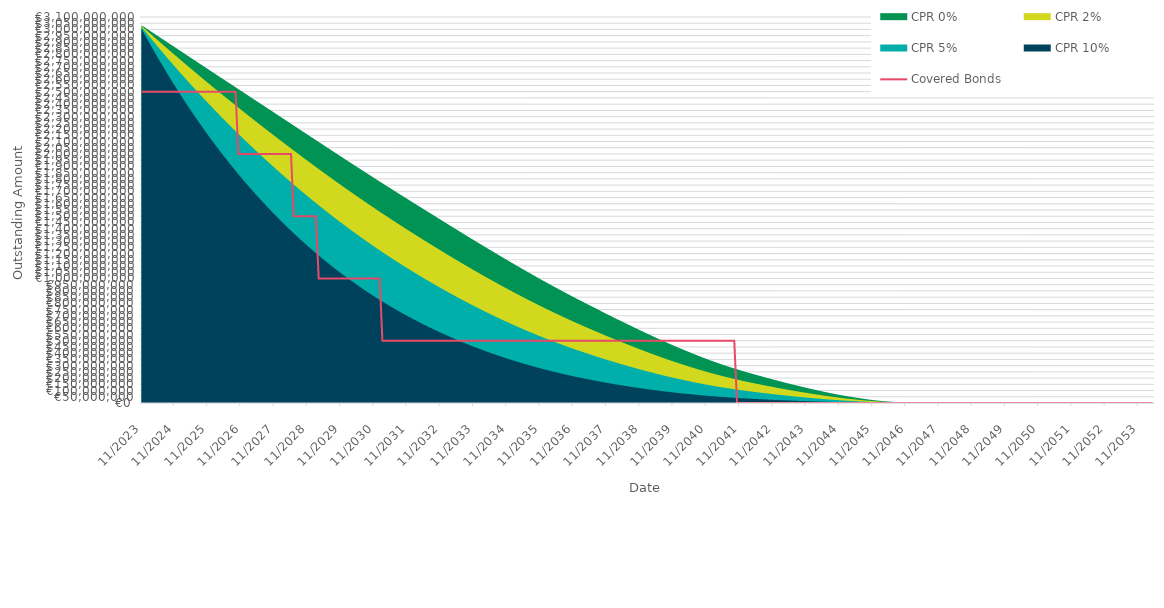
| Category | Covered Bonds |
|---|---|
| 2023-11-30 | 2500000000 |
| 2023-12-31 | 2500000000 |
| 2024-01-31 | 2500000000 |
| 2024-02-29 | 2500000000 |
| 2024-03-31 | 2500000000 |
| 2024-04-30 | 2500000000 |
| 2024-05-31 | 2500000000 |
| 2024-06-30 | 2500000000 |
| 2024-07-31 | 2500000000 |
| 2024-08-31 | 2500000000 |
| 2024-09-30 | 2500000000 |
| 2024-10-31 | 2500000000 |
| 2024-11-30 | 2500000000 |
| 2024-12-31 | 2500000000 |
| 2025-01-31 | 2500000000 |
| 2025-02-28 | 2500000000 |
| 2025-03-31 | 2500000000 |
| 2025-04-30 | 2500000000 |
| 2025-05-31 | 2500000000 |
| 2025-06-30 | 2500000000 |
| 2025-07-31 | 2500000000 |
| 2025-08-31 | 2500000000 |
| 2025-09-30 | 2500000000 |
| 2025-10-31 | 2500000000 |
| 2025-11-30 | 2500000000 |
| 2025-12-31 | 2500000000 |
| 2026-01-31 | 2500000000 |
| 2026-02-28 | 2500000000 |
| 2026-03-31 | 2500000000 |
| 2026-04-30 | 2500000000 |
| 2026-05-31 | 2500000000 |
| 2026-06-30 | 2500000000 |
| 2026-07-31 | 2500000000 |
| 2026-08-31 | 2500000000 |
| 2026-09-30 | 2500000000 |
| 2026-10-31 | 2000000000 |
| 2026-11-30 | 2000000000 |
| 2026-12-31 | 2000000000 |
| 2027-01-31 | 2000000000 |
| 2027-02-28 | 2000000000 |
| 2027-03-31 | 2000000000 |
| 2027-04-30 | 2000000000 |
| 2027-05-31 | 2000000000 |
| 2027-06-30 | 2000000000 |
| 2027-07-31 | 2000000000 |
| 2027-08-31 | 2000000000 |
| 2027-09-30 | 2000000000 |
| 2027-10-31 | 2000000000 |
| 2027-11-30 | 2000000000 |
| 2027-12-31 | 2000000000 |
| 2028-01-31 | 2000000000 |
| 2028-02-29 | 2000000000 |
| 2028-03-31 | 2000000000 |
| 2028-04-30 | 2000000000 |
| 2028-05-31 | 2000000000 |
| 2028-06-30 | 1500000000 |
| 2028-07-31 | 1500000000 |
| 2028-08-31 | 1500000000 |
| 2028-09-30 | 1500000000 |
| 2028-10-31 | 1500000000 |
| 2028-11-30 | 1500000000 |
| 2028-12-31 | 1500000000 |
| 2029-01-31 | 1500000000 |
| 2029-02-28 | 1500000000 |
| 2029-03-31 | 1000000000 |
| 2029-04-30 | 1000000000 |
| 2029-05-31 | 1000000000 |
| 2029-06-30 | 1000000000 |
| 2029-07-31 | 1000000000 |
| 2029-08-31 | 1000000000 |
| 2029-09-30 | 1000000000 |
| 2029-10-31 | 1000000000 |
| 2029-11-30 | 1000000000 |
| 2029-12-31 | 1000000000 |
| 2030-01-31 | 1000000000 |
| 2030-02-28 | 1000000000 |
| 2030-03-31 | 1000000000 |
| 2030-04-30 | 1000000000 |
| 2030-05-31 | 1000000000 |
| 2030-06-30 | 1000000000 |
| 2030-07-31 | 1000000000 |
| 2030-08-31 | 1000000000 |
| 2030-09-30 | 1000000000 |
| 2030-10-31 | 1000000000 |
| 2030-11-30 | 1000000000 |
| 2030-12-31 | 1000000000 |
| 2031-01-31 | 1000000000 |
| 2031-02-28 | 500000000 |
| 2031-03-31 | 500000000 |
| 2031-04-30 | 500000000 |
| 2031-05-31 | 500000000 |
| 2031-06-30 | 500000000 |
| 2031-07-31 | 500000000 |
| 2031-08-31 | 500000000 |
| 2031-09-30 | 500000000 |
| 2031-10-31 | 500000000 |
| 2031-11-30 | 500000000 |
| 2031-12-31 | 500000000 |
| 2032-01-31 | 500000000 |
| 2032-02-29 | 500000000 |
| 2032-03-31 | 500000000 |
| 2032-04-30 | 500000000 |
| 2032-05-31 | 500000000 |
| 2032-06-30 | 500000000 |
| 2032-07-31 | 500000000 |
| 2032-08-31 | 500000000 |
| 2032-09-30 | 500000000 |
| 2032-10-31 | 500000000 |
| 2032-11-30 | 500000000 |
| 2032-12-31 | 500000000 |
| 2033-01-31 | 500000000 |
| 2033-02-28 | 500000000 |
| 2033-03-31 | 500000000 |
| 2033-04-30 | 500000000 |
| 2033-05-31 | 500000000 |
| 2033-06-30 | 500000000 |
| 2033-07-31 | 500000000 |
| 2033-08-31 | 500000000 |
| 2033-09-30 | 500000000 |
| 2033-10-31 | 500000000 |
| 2033-11-30 | 500000000 |
| 2033-12-31 | 500000000 |
| 2034-01-31 | 500000000 |
| 2034-02-28 | 500000000 |
| 2034-03-31 | 500000000 |
| 2034-04-30 | 500000000 |
| 2034-05-31 | 500000000 |
| 2034-06-30 | 500000000 |
| 2034-07-31 | 500000000 |
| 2034-08-31 | 500000000 |
| 2034-09-30 | 500000000 |
| 2034-10-31 | 500000000 |
| 2034-11-30 | 500000000 |
| 2034-12-31 | 500000000 |
| 2035-01-31 | 500000000 |
| 2035-02-28 | 500000000 |
| 2035-03-31 | 500000000 |
| 2035-04-30 | 500000000 |
| 2035-05-31 | 500000000 |
| 2035-06-30 | 500000000 |
| 2035-07-31 | 500000000 |
| 2035-08-31 | 500000000 |
| 2035-09-30 | 500000000 |
| 2035-10-31 | 500000000 |
| 2035-11-30 | 500000000 |
| 2035-12-31 | 500000000 |
| 2036-01-31 | 500000000 |
| 2036-02-29 | 500000000 |
| 2036-03-31 | 500000000 |
| 2036-04-30 | 500000000 |
| 2036-05-31 | 500000000 |
| 2036-06-30 | 500000000 |
| 2036-07-31 | 500000000 |
| 2036-08-31 | 500000000 |
| 2036-09-30 | 500000000 |
| 2036-10-31 | 500000000 |
| 2036-11-30 | 500000000 |
| 2036-12-31 | 500000000 |
| 2037-01-31 | 500000000 |
| 2037-02-28 | 500000000 |
| 2037-03-31 | 500000000 |
| 2037-04-30 | 500000000 |
| 2037-05-31 | 500000000 |
| 2037-06-30 | 500000000 |
| 2037-07-31 | 500000000 |
| 2037-08-31 | 500000000 |
| 2037-09-30 | 500000000 |
| 2037-10-31 | 500000000 |
| 2037-11-30 | 500000000 |
| 2037-12-31 | 500000000 |
| 2038-01-31 | 500000000 |
| 2038-02-28 | 500000000 |
| 2038-03-31 | 500000000 |
| 2038-04-30 | 500000000 |
| 2038-05-31 | 500000000 |
| 2038-06-30 | 500000000 |
| 2038-07-31 | 500000000 |
| 2038-08-31 | 500000000 |
| 2038-09-30 | 500000000 |
| 2038-10-31 | 500000000 |
| 2038-11-30 | 500000000 |
| 2038-12-31 | 500000000 |
| 2039-01-31 | 500000000 |
| 2039-02-28 | 500000000 |
| 2039-03-31 | 500000000 |
| 2039-04-30 | 500000000 |
| 2039-05-31 | 500000000 |
| 2039-06-30 | 500000000 |
| 2039-07-31 | 500000000 |
| 2039-08-31 | 500000000 |
| 2039-09-30 | 500000000 |
| 2039-10-31 | 500000000 |
| 2039-11-30 | 500000000 |
| 2039-12-31 | 500000000 |
| 2040-01-31 | 500000000 |
| 2040-02-29 | 500000000 |
| 2040-03-31 | 500000000 |
| 2040-04-30 | 500000000 |
| 2040-05-31 | 500000000 |
| 2040-06-30 | 500000000 |
| 2040-07-31 | 500000000 |
| 2040-08-31 | 500000000 |
| 2040-09-30 | 500000000 |
| 2040-10-31 | 500000000 |
| 2040-11-30 | 500000000 |
| 2040-12-31 | 500000000 |
| 2041-01-31 | 500000000 |
| 2041-02-28 | 500000000 |
| 2041-03-31 | 500000000 |
| 2041-04-30 | 500000000 |
| 2041-05-31 | 500000000 |
| 2041-06-30 | 500000000 |
| 2041-07-31 | 500000000 |
| 2041-08-31 | 500000000 |
| 2041-09-30 | 500000000 |
| 2041-10-31 | 0 |
| 2041-11-30 | 0 |
| 2041-12-31 | 0 |
| 2042-01-31 | 0 |
| 2042-02-28 | 0 |
| 2042-03-31 | 0 |
| 2042-04-30 | 0 |
| 2042-05-31 | 0 |
| 2042-06-30 | 0 |
| 2042-07-31 | 0 |
| 2042-08-31 | 0 |
| 2042-09-30 | 0 |
| 2042-10-31 | 0 |
| 2042-11-30 | 0 |
| 2042-12-31 | 0 |
| 2043-01-31 | 0 |
| 2043-02-28 | 0 |
| 2043-03-31 | 0 |
| 2043-04-30 | 0 |
| 2043-05-31 | 0 |
| 2043-06-30 | 0 |
| 2043-07-31 | 0 |
| 2043-08-31 | 0 |
| 2043-09-30 | 0 |
| 2043-10-31 | 0 |
| 2043-11-30 | 0 |
| 2043-12-31 | 0 |
| 2044-01-31 | 0 |
| 2044-02-29 | 0 |
| 2044-03-31 | 0 |
| 2044-04-30 | 0 |
| 2044-05-31 | 0 |
| 2044-06-30 | 0 |
| 2044-07-31 | 0 |
| 2044-08-31 | 0 |
| 2044-09-30 | 0 |
| 2044-10-31 | 0 |
| 2044-11-30 | 0 |
| 2044-12-31 | 0 |
| 2045-01-31 | 0 |
| 2045-02-28 | 0 |
| 2045-03-31 | 0 |
| 2045-04-30 | 0 |
| 2045-05-31 | 0 |
| 2045-06-30 | 0 |
| 2045-07-31 | 0 |
| 2045-08-31 | 0 |
| 2045-09-30 | 0 |
| 2045-10-31 | 0 |
| 2045-11-30 | 0 |
| 2045-12-31 | 0 |
| 2046-01-31 | 0 |
| 2046-02-28 | 0 |
| 2046-03-31 | 0 |
| 2046-04-30 | 0 |
| 2046-05-31 | 0 |
| 2046-06-30 | 0 |
| 2046-07-31 | 0 |
| 2046-08-31 | 0 |
| 2046-09-30 | 0 |
| 2046-10-31 | 0 |
| 2046-11-30 | 0 |
| 2046-12-31 | 0 |
| 2047-01-31 | 0 |
| 2047-02-28 | 0 |
| 2047-03-31 | 0 |
| 2047-04-30 | 0 |
| 2047-05-31 | 0 |
| 2047-06-30 | 0 |
| 2047-07-31 | 0 |
| 2047-08-31 | 0 |
| 2047-09-30 | 0 |
| 2047-10-31 | 0 |
| 2047-11-30 | 0 |
| 2047-12-31 | 0 |
| 2048-01-31 | 0 |
| 2048-02-29 | 0 |
| 2048-03-31 | 0 |
| 2048-04-30 | 0 |
| 2048-05-31 | 0 |
| 2048-06-30 | 0 |
| 2048-07-31 | 0 |
| 2048-08-31 | 0 |
| 2048-09-30 | 0 |
| 2048-10-31 | 0 |
| 2048-11-30 | 0 |
| 2048-12-31 | 0 |
| 2049-01-31 | 0 |
| 2049-02-28 | 0 |
| 2049-03-31 | 0 |
| 2049-04-30 | 0 |
| 2049-05-31 | 0 |
| 2049-06-30 | 0 |
| 2049-07-31 | 0 |
| 2049-08-31 | 0 |
| 2049-09-30 | 0 |
| 2049-10-31 | 0 |
| 2049-11-30 | 0 |
| 2049-12-31 | 0 |
| 2050-01-31 | 0 |
| 2050-02-28 | 0 |
| 2050-03-31 | 0 |
| 2050-04-30 | 0 |
| 2050-05-31 | 0 |
| 2050-06-30 | 0 |
| 2050-07-31 | 0 |
| 2050-08-31 | 0 |
| 2050-09-30 | 0 |
| 2050-10-31 | 0 |
| 2050-11-30 | 0 |
| 2050-12-31 | 0 |
| 2051-01-31 | 0 |
| 2051-02-28 | 0 |
| 2051-03-31 | 0 |
| 2051-04-30 | 0 |
| 2051-05-31 | 0 |
| 2051-06-30 | 0 |
| 2051-07-31 | 0 |
| 2051-08-31 | 0 |
| 2051-09-30 | 0 |
| 2051-10-31 | 0 |
| 2051-11-30 | 0 |
| 2051-12-31 | 0 |
| 2052-01-31 | 0 |
| 2052-02-29 | 0 |
| 2052-03-31 | 0 |
| 2052-04-30 | 0 |
| 2052-05-31 | 0 |
| 2052-06-30 | 0 |
| 2052-07-31 | 0 |
| 2052-08-31 | 0 |
| 2052-09-30 | 0 |
| 2052-10-31 | 0 |
| 2052-11-30 | 0 |
| 2052-12-31 | 0 |
| 2053-01-31 | 0 |
| 2053-02-28 | 0 |
| 2053-03-31 | 0 |
| 2053-04-30 | 0 |
| 2053-05-31 | 0 |
| 2053-06-30 | 0 |
| 2053-07-31 | 0 |
| 2053-08-31 | 0 |
| 2053-09-30 | 0 |
| 2053-10-31 | 0 |
| 2053-11-30 | 0 |
| 2053-12-31 | 0 |
| 2054-01-31 | 0 |
| 2054-02-28 | 0 |
| 2054-03-31 | 0 |
| 2054-04-30 | 0 |